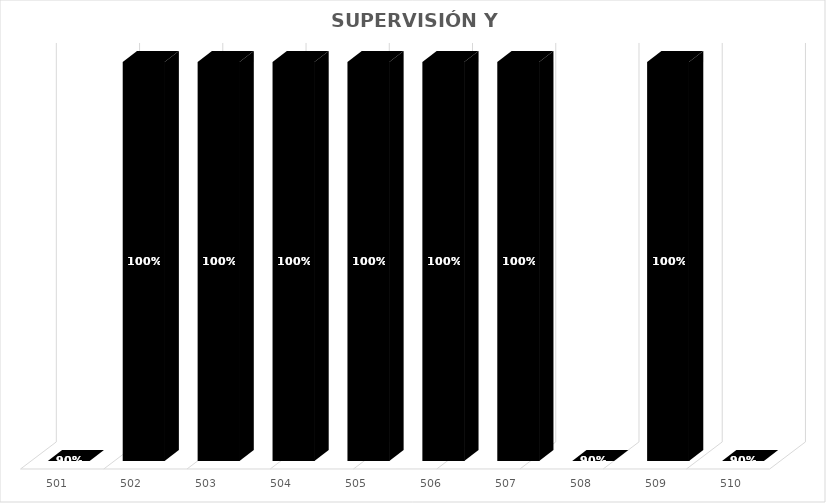
| Category | % Avance |
|---|---|
| 501.0 | 0.9 |
| 502.0 | 1 |
| 503.0 | 1 |
| 504.0 | 1 |
| 505.0 | 1 |
| 506.0 | 1 |
| 507.0 | 1 |
| 508.0 | 0.9 |
| 509.0 | 1 |
| 510.0 | 0.9 |